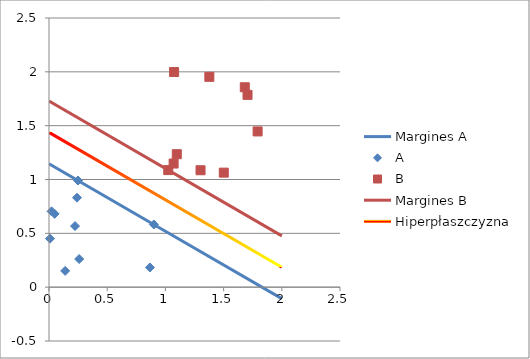
| Category | Margines A |
|---|---|
| 0.0 | 1.146 |
| 2.0 | -0.106 |